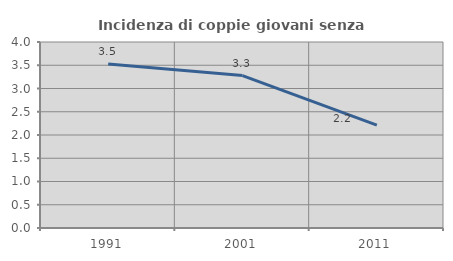
| Category | Incidenza di coppie giovani senza figli |
|---|---|
| 1991.0 | 3.528 |
| 2001.0 | 3.279 |
| 2011.0 | 2.214 |